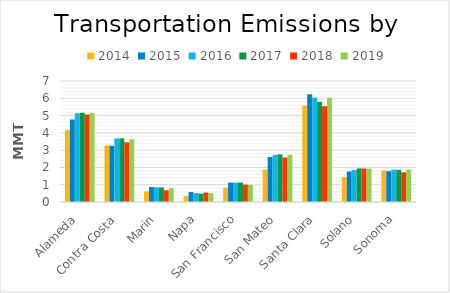
| Category | 2014 | 2015 | 2016 | 2017 | 2018 | 2019 |
|---|---|---|---|---|---|---|
| Alameda | 4.154 | 4.773 | 5.133 | 5.163 | 5.065 | 5.147 |
| Contra Costa | 3.273 | 3.252 | 3.679 | 3.682 | 3.457 | 3.624 |
| Marin | 0.614 | 0.865 | 0.852 | 0.843 | 0.681 | 0.799 |
| Napa | 0.338 | 0.576 | 0.518 | 0.484 | 0.546 | 0.509 |
| San Francisco | 0.829 | 1.124 | 1.126 | 1.124 | 1.001 | 0.983 |
| San Mateo | 1.874 | 2.6 | 2.725 | 2.755 | 2.573 | 2.723 |
| Santa Clara | 5.579 | 6.231 | 6.039 | 5.792 | 5.541 | 6.028 |
| Solano | 1.43 | 1.768 | 1.848 | 1.942 | 1.935 | 1.932 |
| Sonoma | 1.828 | 1.787 | 1.875 | 1.862 | 1.718 | 1.873 |